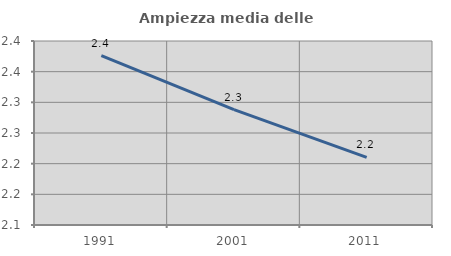
| Category | Ampiezza media delle famiglie |
|---|---|
| 1991.0 | 2.376 |
| 2001.0 | 2.288 |
| 2011.0 | 2.21 |